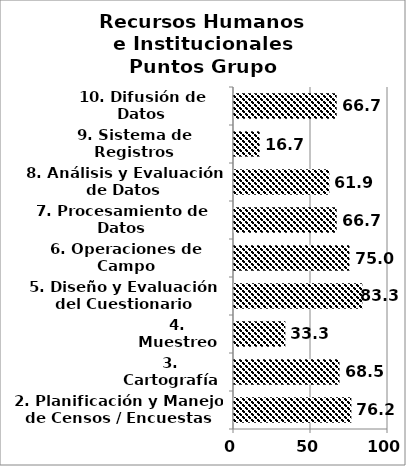
| Category | Series 0 |
|---|---|
| 2. Planificación y Manejo de Censos / Encuestas | 76.19 |
| 3. Cartografía | 68.519 |
| 4. Muestreo | 33.333 |
| 5. Diseño y Evaluación del Cuestionario | 83.333 |
| 6. Operaciones de Campo | 75 |
| 7. Procesamiento de Datos | 66.667 |
| 8. Análisis y Evaluación de Datos | 61.905 |
| 9. Sistema de Registros Administrativos | 16.667 |
| 10. Difusión de Datos | 66.667 |